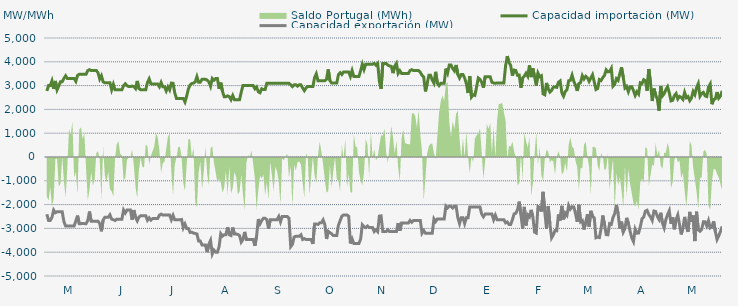
| Category | Capacidad importación (MW) | Capacidad exportación (MW) |
|---|---|---|
| 0 | 2775 | -2404.167 |
| 1900-01-01 | 3000 | -2666.667 |
| 1900-01-02 | 3000 | -2666.667 |
| 1900-01-03 | 3200 | -2533.333 |
| 1900-01-04 | 2862.5 | -2233.333 |
| 1900-01-05 | 3195.833 | -2341.667 |
| 1900-01-06 | 2822.917 | -2300 |
| 1900-01-07 | 2983.333 | -2300 |
| 1900-01-08 | 3166.667 | -2300 |
| 1900-01-09 | 3166.667 | -2300 |
| 1900-01-10 | 3300 | -2712.5 |
| 1900-01-11 | 3412.5 | -2900 |
| 1900-01-12 | 3300 | -2900 |
| 1900-01-13 | 3300 | -2900 |
| 1900-01-14 | 3300 | -2900 |
| 1900-01-15 | 3300 | -2900 |
| 1900-01-16 | 3300 | -2900 |
| 1900-01-17 | 3179.167 | -2687.5 |
| 1900-01-18 | 3425 | -2462.5 |
| 1900-01-19 | 3479.167 | -2800 |
| 1900-01-20 | 3479.167 | -2800 |
| 1900-01-21 | 3479.167 | -2791.667 |
| 1900-01-22 | 3479.167 | -2800 |
| 1900-01-23 | 3479.167 | -2800 |
| 1900-01-24 | 3633.333 | -2666.667 |
| 1900-01-25 | 3670.833 | -2291.667 |
| 1900-01-26 | 3633.333 | -2700 |
| 1900-01-27 | 3633.333 | -2700 |
| 1900-01-28 | 3633.333 | -2700 |
| 1900-01-29 | 3633.333 | -2700 |
| 1900-01-30 | 3541.667 | -2695.833 |
| 1900-01-31 | 3275 | -2800 |
| 1900-02-01 | 3412.5 | -3120.833 |
| 1900-02-02 | 3158.333 | -2650 |
| 1900-02-03 | 3116.667 | -2533.333 |
| 1900-02-04 | 3116.667 | -2533.333 |
| 1900-02-05 | 3116.667 | -2533.333 |
| 1900-02-06 | 3116.667 | -2429.167 |
| 1900-02-07 | 2825 | -2612.5 |
| 1900-02-08 | 3054.167 | -2633.333 |
| 1900-02-09 | 2825 | -2668.75 |
| 1900-02-10 | 2825 | -2612.5 |
| 1900-02-11 | 2825 | -2612.5 |
| 1900-02-12 | 2825 | -2612.5 |
| 1900-02-13 | 2825 | -2612.5 |
| 1900-02-14 | 2995.833 | -2229.167 |
| 1900-02-15 | 3075 | -2352.083 |
| 1900-02-16 | 2995.833 | -2229.167 |
| 1900-02-17 | 2958.333 | -2229.167 |
| 1900-02-18 | 2958.333 | -2229.167 |
| 1900-02-19 | 2981.25 | -2641.667 |
| 1900-02-20 | 2958.333 | -2229.167 |
| 1900-02-21 | 2875 | -2533.333 |
| 1900-02-22 | 3195.833 | -2683.333 |
| 1900-02-23 | 2875 | -2525 |
| 1900-02-24 | 2825 | -2466.667 |
| 1900-02-25 | 2825 | -2466.667 |
| 1900-02-26 | 2825 | -2466.667 |
| 1900-02-27 | 2825 | -2466.667 |
| 1900-02-28 | 3129.167 | -2658.333 |
| 1900-02-28 | 3283.333 | -2558.333 |
| 1900-03-01 | 3081.25 | -2654.167 |
| 1900-03-02 | 3062.5 | -2587.5 |
| 1900-03-03 | 3062.5 | -2587.5 |
| 1900-03-04 | 3062.5 | -2587.5 |
| 1900-03-05 | 3062.5 | -2587.5 |
| 1900-03-06 | 2950 | -2441.667 |
| 1900-03-07 | 3133.333 | -2400 |
| 1900-03-08 | 2950 | -2441.667 |
| 1900-03-09 | 2950 | -2441.667 |
| 1900-03-10 | 2775 | -2441.667 |
| 1900-03-11 | 2950 | -2441.667 |
| 1900-03-12 | 2818.75 | -2441.667 |
| 1900-03-13 | 3104.167 | -2637.5 |
| 1900-03-14 | 3100 | -2452.083 |
| 1900-03-15 | 2697.917 | -2637.5 |
| 1900-03-16 | 2462.5 | -2637.5 |
| 1900-03-17 | 2462.5 | -2637.5 |
| 1900-03-18 | 2462.5 | -2637.5 |
| 1900-03-19 | 2462.5 | -2625 |
| 1900-03-20 | 2462.5 | -2975 |
| 1900-03-21 | 2310.417 | -2816.667 |
| 1900-03-22 | 2562.5 | -3000 |
| 1900-03-23 | 2862.5 | -3000 |
| 1900-03-24 | 3025 | -3170.833 |
| 1900-03-25 | 3087.5 | -3158.333 |
| 1900-03-26 | 3106.25 | -3195.833 |
| 1900-03-27 | 3154.167 | -3212.917 |
| 1900-03-28 | 3377.083 | -3233.333 |
| 1900-03-29 | 3145.833 | -3533.333 |
| 1900-03-30 | 3145.833 | -3533.333 |
| 1900-03-31 | 3262.5 | -3700 |
| 1900-04-01 | 3262.5 | -3700 |
| 1900-04-02 | 3262.5 | -3700 |
| 1900-04-03 | 3233.333 | -4000 |
| 1900-04-04 | 3158.333 | -3662.5 |
| 1900-04-05 | 2970.833 | -3504.167 |
| 1900-04-06 | 3300 | -4075 |
| 1900-04-07 | 3225 | -3912.5 |
| 1900-04-08 | 3300 | -4000 |
| 1900-04-09 | 3300 | -4000 |
| 1900-04-10 | 2866.667 | -3766.667 |
| 1900-04-11 | 3125 | -3222.917 |
| 1900-04-12 | 2754.167 | -3325 |
| 1900-04-13 | 2533.333 | -3266.667 |
| 1900-04-14 | 2533.333 | -3266.667 |
| 1900-04-15 | 2570.833 | -2947.917 |
| 1900-04-16 | 2533.333 | -3266.667 |
| 1900-04-17 | 2408.333 | -3300 |
| 1900-04-18 | 2583.333 | -2962.5 |
| 1900-04-19 | 2408.333 | -3237.5 |
| 1900-04-20 | 2408.333 | -3233.333 |
| 1900-04-21 | 2408.333 | -3254.167 |
| 1900-04-22 | 2408.333 | -3300 |
| 1900-04-23 | 2729.167 | -3575 |
| 1900-04-24 | 3000 | -3466.667 |
| 1900-04-25 | 3000 | -3147.917 |
| 1900-04-26 | 3000 | -3466.667 |
| 1900-04-27 | 3000 | -3466.667 |
| 1900-04-28 | 3000 | -3466.667 |
| 1900-04-29 | 3000 | -3466.667 |
| 1900-04-30 | 3000 | -3466.667 |
| 1900-05-01 | 2866.667 | -3733.333 |
| 1900-05-02 | 2941.667 | -3320.833 |
| 1900-05-03 | 2741.667 | -2608.333 |
| 1900-05-04 | 2700 | -2808.333 |
| 1900-05-05 | 2866.667 | -2670.833 |
| 1900-05-06 | 2833.333 | -2575 |
| 1900-05-07 | 2833.333 | -2575 |
| 1900-05-08 | 3100 | -2633.333 |
| 1900-05-09 | 3100 | -3008.333 |
| 1900-05-10 | 3100 | -2633.333 |
| 1900-05-11 | 3100 | -2633.333 |
| 1900-05-12 | 3100 | -2633.333 |
| 1900-05-13 | 3100 | -2633.333 |
| 1900-05-14 | 3100 | -2633.333 |
| 1900-05-15 | 3100 | -2500 |
| 1900-05-16 | 3100 | -2725 |
| 1900-05-17 | 3100 | -2500 |
| 1900-05-18 | 3100 | -2500 |
| 1900-05-19 | 3100 | -2500 |
| 1900-05-20 | 3100 | -2500 |
| 1900-05-21 | 3100 | -2575 |
| 1900-05-22 | 3033.333 | -3766.667 |
| 1900-05-23 | 2958.333 | -3672.917 |
| 1900-05-24 | 3033.333 | -3360.417 |
| 1900-05-25 | 3033.333 | -3333.333 |
| 1900-05-26 | 2976.875 | -3333.333 |
| 1900-05-27 | 3033.333 | -3333.333 |
| 1900-05-28 | 3033.333 | -3266.667 |
| 1900-05-29 | 2900 | -3466.667 |
| 1900-05-30 | 2787.5 | -3429.167 |
| 1900-05-31 | 2900 | -3466.667 |
| 1900-06-01 | 2966.667 | -3466.667 |
| 1900-06-02 | 2966.667 | -3466.667 |
| 1900-06-03 | 2966.667 | -3466.667 |
| 1900-06-04 | 2966.667 | -3654.167 |
| 1900-06-05 | 3335.417 | -2816.667 |
| 1900-06-06 | 3495.833 | -2816.667 |
| 1900-06-07 | 3204.167 | -2833.333 |
| 1900-06-08 | 3204.167 | -2766.667 |
| 1900-06-09 | 3204.167 | -2766.667 |
| 1900-06-10 | 3204.167 | -2641.667 |
| 1900-06-11 | 3204.167 | -2833.333 |
| 1900-06-12 | 3266.667 | -3443.75 |
| 1900-06-13 | 3679.167 | -3122.917 |
| 1900-06-14 | 3208.333 | -3179.167 |
| 1900-06-15 | 3108.333 | -3225 |
| 1900-06-16 | 3108.333 | -3300 |
| 1900-06-17 | 3108.333 | -3300 |
| 1900-06-18 | 3108.333 | -3300 |
| 1900-06-19 | 3466.667 | -2866.667 |
| 1900-06-20 | 3541.667 | -2672.5 |
| 1900-06-21 | 3466.667 | -2487.5 |
| 1900-06-22 | 3570.833 | -2433.333 |
| 1900-06-23 | 3570.833 | -2433.333 |
| 1900-06-24 | 3570.833 | -2433.333 |
| 1900-06-25 | 3570.833 | -2491.667 |
| 1900-06-26 | 3383.333 | -3633.333 |
| 1900-06-27 | 3632 | -3440 |
| 1900-06-28 | 3383.333 | -3633.333 |
| 1900-06-29 | 3383.333 | -3633.333 |
| 1900-06-30 | 3383.333 | -3633.333 |
| 1900-07-01 | 3383.333 | -3633.333 |
| 1900-07-02 | 3625 | -3445.833 |
| 1900-07-03 | 3900 | -2849.25 |
| 1900-07-04 | 3675 | -2929.167 |
| 1900-07-05 | 3900 | -2966.667 |
| 1900-07-06 | 3900 | -2900 |
| 1900-07-07 | 3900 | -2966.667 |
| 1900-07-08 | 3900 | -2966.667 |
| 1900-07-09 | 3900 | -2966.667 |
| 1900-07-10 | 3933.333 | -3133.333 |
| 1900-07-11 | 3858.333 | -3058.333 |
| 1900-07-12 | 3933.333 | -3133.333 |
| 1900-07-13 | 3175 | -2483.333 |
| 1900-07-14 | 2862.5 | -2475 |
| 1900-07-15 | 3933.333 | -3133.333 |
| 1900-07-16 | 3933.333 | -3133.333 |
| 1900-07-17 | 3933.333 | -3133.333 |
| 1900-07-18 | 3858.333 | -3058.333 |
| 1900-07-19 | 3825 | -3133.333 |
| 1900-07-20 | 3808.333 | -3133.333 |
| 1900-07-21 | 3525 | -3133.333 |
| 1900-07-22 | 3816.708 | -3133.333 |
| 1900-07-23 | 3933.333 | -3133.333 |
| 1900-07-24 | 3512.5 | -2775 |
| 1900-07-25 | 3627.083 | -3095.833 |
| 1900-07-26 | 3512.5 | -2775 |
| 1900-07-27 | 3512.5 | -2775 |
| 1900-07-28 | 3512.5 | -2775 |
| 1900-07-29 | 3512.5 | -2775 |
| 1900-07-30 | 3512.5 | -2775 |
| 1900-07-31 | 3633.333 | -2666.667 |
| 1900-08-01 | 3670.833 | -2741.667 |
| 1900-08-02 | 3633.333 | -2666.667 |
| 1900-08-03 | 3633.333 | -2666.667 |
| 1900-08-04 | 3633.333 | -2666.667 |
| 1900-08-05 | 3633.333 | -2666.667 |
| 1900-08-06 | 3557.083 | -2666.667 |
| 1900-08-07 | 3433.333 | -3200 |
| 1900-08-08 | 3358.333 | -3087.5 |
| 1900-08-09 | 2756.25 | -3200 |
| 1900-08-10 | 3066.667 | -3200 |
| 1900-08-11 | 3433.333 | -3200 |
| 1900-08-12 | 3433.333 | -3200 |
| 1900-08-13 | 3232.417 | -3200 |
| 1900-08-14 | 3100 | -2600 |
| 1900-08-15 | 3579.167 | -2712.5 |
| 1900-08-16 | 3100 | -2600 |
| 1900-08-17 | 3000.75 | -2600 |
| 1900-08-18 | 3100 | -2600 |
| 1900-08-19 | 3100 | -2600 |
| 1900-08-20 | 3100 | -2600 |
| 1900-08-21 | 3712.917 | -2066.667 |
| 1900-08-22 | 3527.083 | -2141.667 |
| 1900-08-23 | 3866.667 | -2066.667 |
| 1900-08-24 | 3866.667 | -2066.667 |
| 1900-08-25 | 3716.667 | -2141.667 |
| 1900-08-26 | 3616.667 | -2066.667 |
| 1900-08-27 | 3866.667 | -2066.667 |
| 1900-08-28 | 3466.667 | -2550 |
| 1900-08-29 | 3316.667 | -2795.833 |
| 1900-08-30 | 3466.667 | -2550 |
| 1900-08-31 | 3466.667 | -2550 |
| 1900-09-01 | 3316.667 | -2795.833 |
| 1900-09-02 | 3082.167 | -2550 |
| 1900-09-03 | 2687.5 | -2550 |
| 1900-09-04 | 3400 | -2100 |
| 1900-09-05 | 2520.833 | -2100 |
| 1900-09-06 | 2614.583 | -2100 |
| 1900-09-07 | 2591.25 | -2100 |
| 1900-09-08 | 2932.083 | -2100 |
| 1900-09-09 | 3318.75 | -2100 |
| 1900-09-10 | 3262.5 | -2100 |
| 1900-09-11 | 3139.583 | -2400 |
| 1900-09-12 | 2912.5 | -2512.5 |
| 1900-09-13 | 3366.667 | -2400 |
| 1900-09-14 | 3366.667 | -2400 |
| 1900-09-15 | 3366.667 | -2400 |
| 1900-09-16 | 3366.667 | -2400 |
| 1900-09-17 | 3139.583 | -2400 |
| 1900-09-18 | 3108.333 | -2633.333 |
| 1900-09-19 | 3100 | -2445.833 |
| 1900-09-20 | 3108.333 | -2633.333 |
| 1900-09-21 | 3108.333 | -2633.333 |
| 1900-09-22 | 3108.333 | -2633.333 |
| 1900-09-23 | 3108.333 | -2633.333 |
| 1900-09-24 | 3108.333 | -2633.333 |
| 1900-09-25 | 3822.917 | -2766.667 |
| 1900-09-26 | 4239.583 | -2729.167 |
| 1900-09-27 | 3979.167 | -2833.333 |
| 1900-09-28 | 3841.667 | -2833.333 |
| 1900-09-29 | 3414.375 | -2634.375 |
| 1900-09-30 | 3652.5 | -2392.5 |
| 1900-10-01 | 3633.75 | -2364.375 |
| 1900-10-02 | 3431.25 | -2212.5 |
| 1900-10-03 | 3442.5 | -1876.875 |
| 1900-10-04 | 2908.125 | -2420.625 |
| 1900-10-05 | 3318.75 | -3009.375 |
| 1900-10-06 | 3401.25 | -2096.25 |
| 1900-10-07 | 3519.375 | -2876.25 |
| 1900-10-08 | 3392.5 | -2430 |
| 1900-10-09 | 3856.875 | -2512.5 |
| 1900-10-10 | 3356.25 | -2221.875 |
| 1900-10-11 | 3727.5 | -2516.25 |
| 1900-10-12 | 3372.5 | -3157.5 |
| 1900-10-13 | 3000.208 | -3195 |
| 1900-10-14 | 3522.083 | -2079.375 |
| 1900-10-15 | 3371.667 | -2122.5 |
| 1900-10-16 | 3412.5 | -2291.25 |
| 1900-10-17 | 2653.125 | -1464.375 |
| 1900-10-18 | 2615 | -2298.75 |
| 1900-10-19 | 3110.625 | -3018.75 |
| 1900-10-20 | 2861.792 | -2062.5 |
| 1900-10-21 | 2726.042 | -2823.75 |
| 1900-10-22 | 2799.583 | -3397.5 |
| 1900-10-23 | 2936.25 | -3273.75 |
| 1900-10-24 | 2938.125 | -3091.875 |
| 1900-10-25 | 2925 | -3101.25 |
| 1900-10-26 | 3136.875 | -2413.125 |
| 1900-10-27 | 3195.208 | -2666.25 |
| 1900-10-28 | 2702.083 | -2053.125 |
| 1900-10-29 | 2556.042 | -2621.25 |
| 1900-10-30 | 2748.75 | -2355 |
| 1900-10-31 | 2825.625 | -2448.75 |
| 1900-11-01 | 3204.375 | -2034.375 |
| 1900-11-02 | 3223.333 | -2188.125 |
| 1900-11-03 | 3440.625 | -2092.5 |
| 1900-11-04 | 3180 | -2100 |
| 1900-11-05 | 3016.875 | -2368.125 |
| 1900-11-06 | 2777.292 | -2722.5 |
| 1900-11-07 | 3084.375 | -2008.125 |
| 1900-11-08 | 3130.833 | -2720.625 |
| 1900-11-09 | 3418.75 | -2671.875 |
| 1900-11-10 | 3277.917 | -3046.875 |
| 1900-11-11 | 3390.833 | -2735.625 |
| 1900-11-12 | 3326.25 | -2407.5 |
| 1900-11-13 | 3180 | -2921.25 |
| 1900-11-14 | 3320.625 | -2262.708 |
| 1900-11-15 | 3457.5 | -2488.125 |
| 1900-11-16 | 3158.75 | -2557.5 |
| 1900-11-17 | 2836.25 | -3393.75 |
| 1900-11-18 | 2879.167 | -3365.625 |
| 1900-11-19 | 3254.167 | -3384.375 |
| 1900-11-20 | 3214.167 | -3018.75 |
| 1900-11-21 | 3335.625 | -2460 |
| 1900-11-22 | 3429.375 | -2818.125 |
| 1900-11-23 | 3663.75 | -3258.75 |
| 1900-11-24 | 3577.583 | -3268.125 |
| 1900-11-25 | 3586.875 | -2801.25 |
| 1900-11-26 | 3721.875 | -2831.25 |
| 1900-11-27 | 2977.5 | -2542.5 |
| 1900-11-28 | 3058.043 | -2379.13 |
| 1900-11-29 | 3294.375 | -2013.75 |
| 1900-11-30 | 3223.125 | -2388.75 |
| 1900-12-01 | 3506.25 | -3005.625 |
| 1900-12-02 | 3770.625 | -2718.75 |
| 1900-12-03 | 3346.875 | -3153.75 |
| 1900-12-04 | 2898.75 | -3009.375 |
| 1900-12-05 | 2966.25 | -2556.708 |
| 1900-12-06 | 2745.417 | -2786.25 |
| 1900-12-07 | 2951.25 | -3112.083 |
| 1900-12-08 | 2955 | -3401.25 |
| 1900-12-09 | 2788.125 | -3553.125 |
| 1900-12-10 | 2587.5 | -3033.75 |
| 1900-12-11 | 2745 | -3200.625 |
| 1900-12-12 | 2645.625 | -3195 |
| 1900-12-13 | 3116.25 | -2932.5 |
| 1900-12-14 | 3084.375 | -2598.75 |
| 1900-12-15 | 3247.5 | -2520 |
| 1900-12-16 | 3208.125 | -2272.5 |
| 1900-12-17 | 2782.708 | -2238.75 |
| 1900-12-18 | 3697.5 | -2418.75 |
| 1900-12-19 | 3103.125 | -2514.375 |
| 1900-12-20 | 2351.667 | -2662.5 |
| 1900-12-21 | 2876.25 | -2268.75 |
| 1900-12-22 | 2613.75 | -2287.5 |
| 1900-12-23 | 2422.5 | -2499.375 |
| 1900-12-24 | 1945.5 | -2625 |
| 1900-12-25 | 2981.25 | -2341.875 |
| 1900-12-26 | 2567.917 | -2775 |
| 1900-12-27 | 2658.542 | -2977.5 |
| 1900-12-28 | 2829.375 | -2626.875 |
| 1900-12-29 | 2951.25 | -2420.625 |
| 1900-12-30 | 2701.875 | -2257.5 |
| 1900-12-31 | 2356.875 | -2804.792 |
| 1901-01-01 | 2381.875 | -2527.5 |
| 1901-01-02 | 2578.125 | -3035.625 |
| 1901-01-03 | 2666.25 | -2621.042 |
| 1901-01-04 | 2439.583 | -2431.875 |
| 1901-01-05 | 2546.667 | -2835 |
| 1901-01-06 | 2503.125 | -3253.125 |
| 1901-01-07 | 2418.75 | -2985 |
| 1901-01-08 | 2711.25 | -2516.25 |
| 1901-01-09 | 2490 | -2932.5 |
| 1901-01-10 | 2538.75 | -3144.375 |
| 1901-01-11 | 2367.708 | -2306.25 |
| 1901-01-12 | 2476.875 | -2730 |
| 1901-01-13 | 2754.375 | -2460 |
| 1901-01-14 | 2620.833 | -3533.333 |
| 1901-01-15 | 2916.875 | -2297.5 |
| 1901-01-16 | 3082.5 | -3063.75 |
| 1901-01-17 | 2553.75 | -3120 |
| 1901-01-18 | 2671.875 | -3043.125 |
| 1901-01-19 | 2716.875 | -2722.5 |
| 1901-01-20 | 2568.75 | -2724.375 |
| 1901-01-21 | 2540.625 | -2896.875 |
| 1901-01-22 | 2938.125 | -2677.5 |
| 1901-01-23 | 3066.667 | -2979.167 |
| 1901-01-24 | 2218.125 | -2926.875 |
| 1901-01-25 | 2411.25 | -2701.875 |
| 1901-01-26 | 2443.125 | -3125.625 |
| 1901-01-27 | 2729.167 | -3466.667 |
| 1901-01-28 | 2471.25 | -3315 |
| 1901-01-29 | 2561.875 | -3127.375 |
| 1901-01-30 | 2778.75 | -2917.5 |